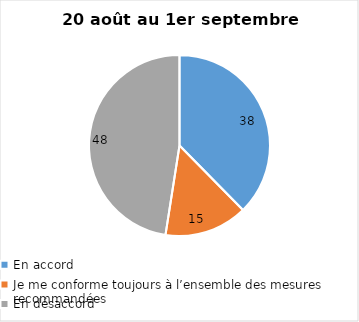
| Category | Series 0 |
|---|---|
| En accord | 38 |
| Je me conforme toujours à l’ensemble des mesures recommandées | 15 |
| En désaccord | 48 |